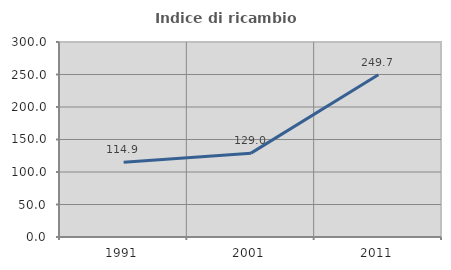
| Category | Indice di ricambio occupazionale  |
|---|---|
| 1991.0 | 114.932 |
| 2001.0 | 129 |
| 2011.0 | 249.677 |